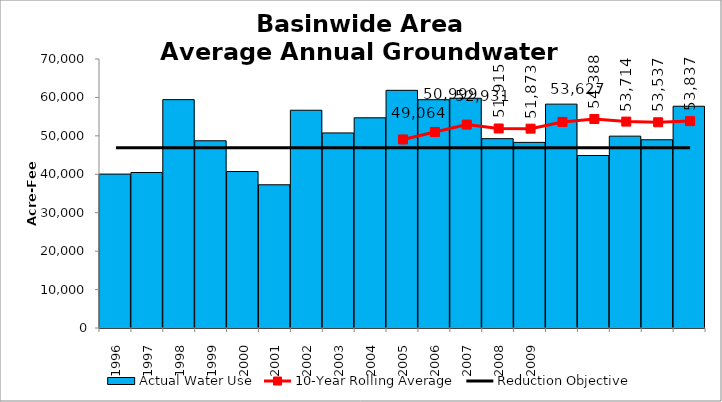
| Category | Actual Water Use |
|---|---|
| 1996.0 | 40053.77 |
| 1997.0 | 40466.63 |
| 1998.0 | 59427.13 |
| 1999.0 | 48724.19 |
| 2000.0 | 40717.25 |
| 2001.0 | 37272.12 |
| 2002.0 | 56667.28 |
| 2003.0 | 50761.3 |
| 2004.0 | 54699.332 |
| 2005.0 | 61847.74 |
| 2006.0 | 59408.56 |
| 2007.0 | 59782.98 |
| 2008.0 | 49270.47 |
| 2009.0 | 48302.48 |